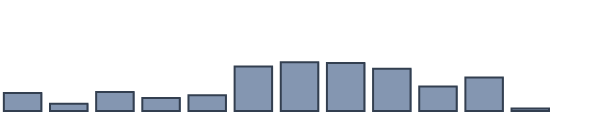
| Category | Series 0 |
|---|---|
| 0 | 5.7 |
| 1 | 2.3 |
| 2 | 6 |
| 3 | 4.1 |
| 4 | 5 |
| 5 | 14 |
| 6 | 15.4 |
| 7 | 15.1 |
| 8 | 13.3 |
| 9 | 7.7 |
| 10 | 10.6 |
| 11 | 0.8 |
| 12 | 0 |